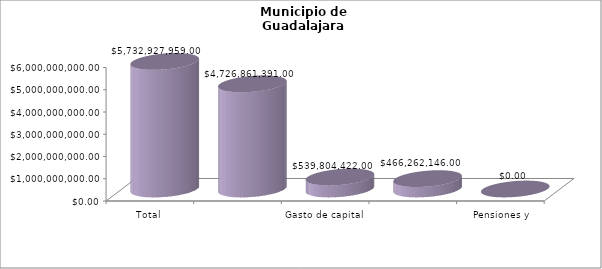
| Category | Municipio de Guadalajara
Tipo de Gasto de los ejercicios fiscales 2017-2022 |
|---|---|
| Total | 5732927959 |
| Gasto corriente | 4726861391 |
| Gasto de capital | 539804422 |
| Amortización de la deuda y disminución de pasivos | 466262146 |
| Pensiones y Jubilaciones | 0 |